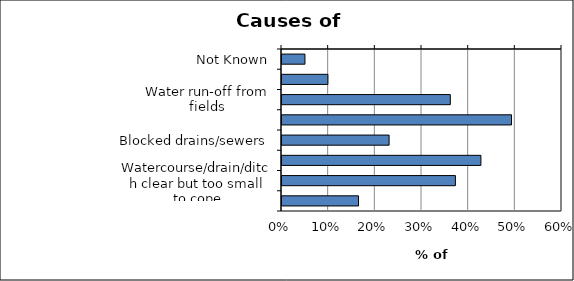
| Category | Series 0 |
|---|---|
| Not Known | 0.049 |
| Flooding from the River Lugg | 0.098 |
| Water run-off from fields | 0.361 |
| Water run-off from roads | 0.492 |
| Blocked drains/sewers | 0.23 |
| Blocked culvert | 0.426 |
| Watercourse/drain/ditch clear but too small to cope | 0.372 |
| Other | 0.164 |